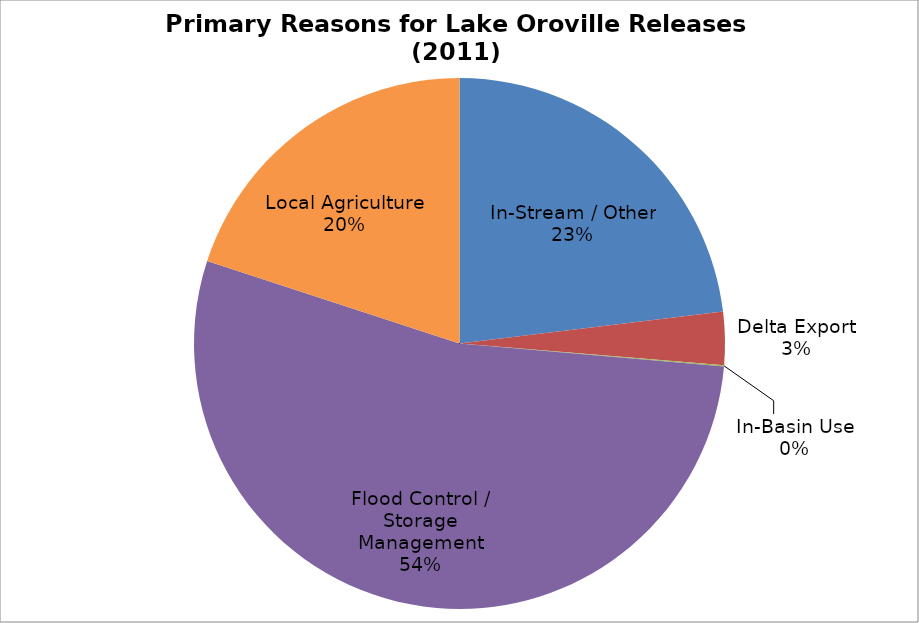
| Category | Series 1 |
|---|---|
| In-Stream / Other | 1190.08 |
| Delta Export | 166.553 |
| In-Basin Use | 3.563 |
| Flood Control / Storage Management | 2766.961 |
| Local Agriculture | 1029.911 |